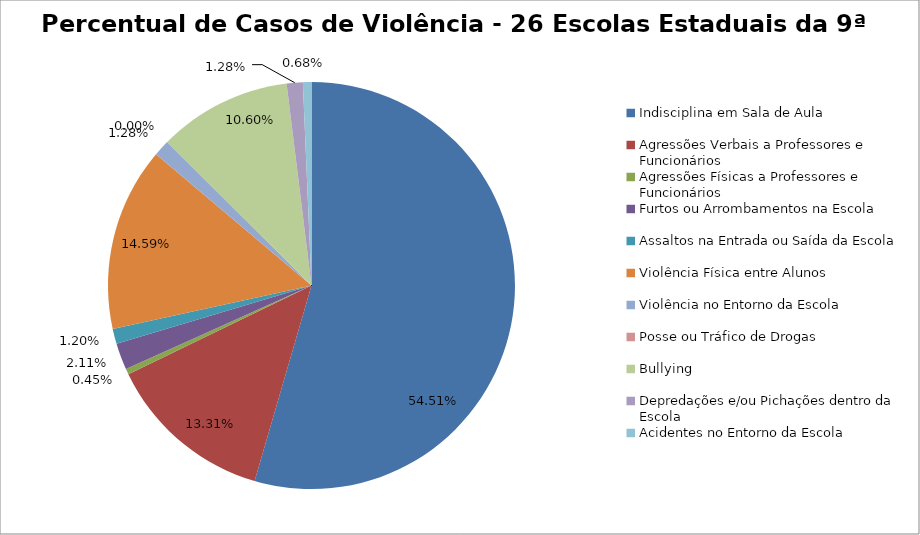
| Category | Percentual |
|---|---|
| Indisciplina em Sala de Aula | 0.545 |
| Agressões Verbais a Professores e Funcionários | 0.133 |
| Agressões Físicas a Professores e Funcionários | 0.005 |
| Furtos ou Arrombamentos na Escola | 0.021 |
| Assaltos na Entrada ou Saída da Escola | 0.012 |
| Violência Física entre Alunos | 0.146 |
| Violência no Entorno da Escola | 0.013 |
| Posse ou Tráfico de Drogas | 0 |
| Bullying | 0.106 |
| Depredações e/ou Pichações dentro da Escola | 0.013 |
| Acidentes no Entorno da Escola | 0.007 |